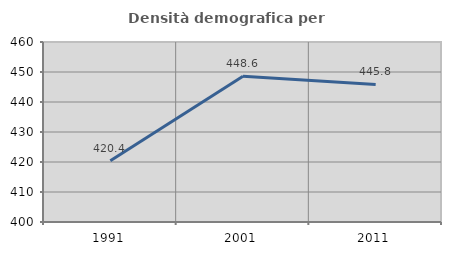
| Category | Densità demografica |
|---|---|
| 1991.0 | 420.418 |
| 2001.0 | 448.615 |
| 2011.0 | 445.841 |